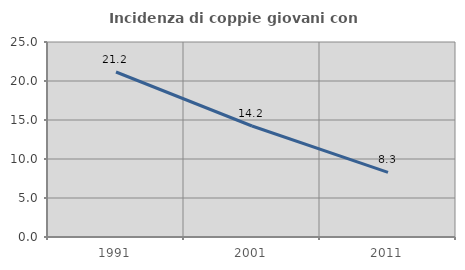
| Category | Incidenza di coppie giovani con figli |
|---|---|
| 1991.0 | 21.154 |
| 2001.0 | 14.231 |
| 2011.0 | 8.276 |